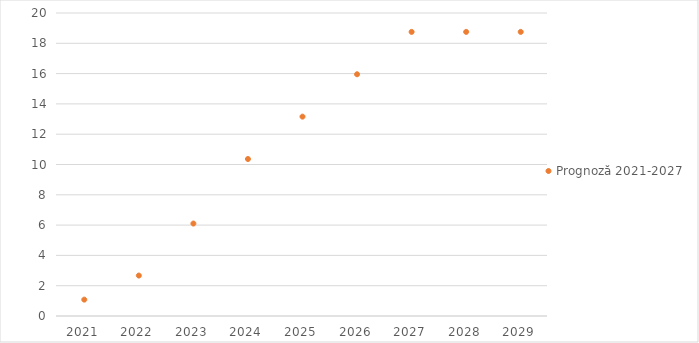
| Category | Prognoză 2021-2027 |
|---|---|
| 2021.0 | 1.081 |
| 2022.0 | 2.67 |
| 2023.0 | 6.103 |
| 2024.0 | 10.362 |
| 2025.0 | 13.159 |
| 2026.0 | 15.956 |
| 2027.0 | 18.753 |
| 2028.0 | 18.753 |
| 2029.0 | 18.753 |